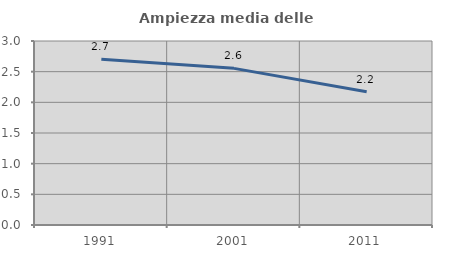
| Category | Ampiezza media delle famiglie |
|---|---|
| 1991.0 | 2.703 |
| 2001.0 | 2.554 |
| 2011.0 | 2.174 |